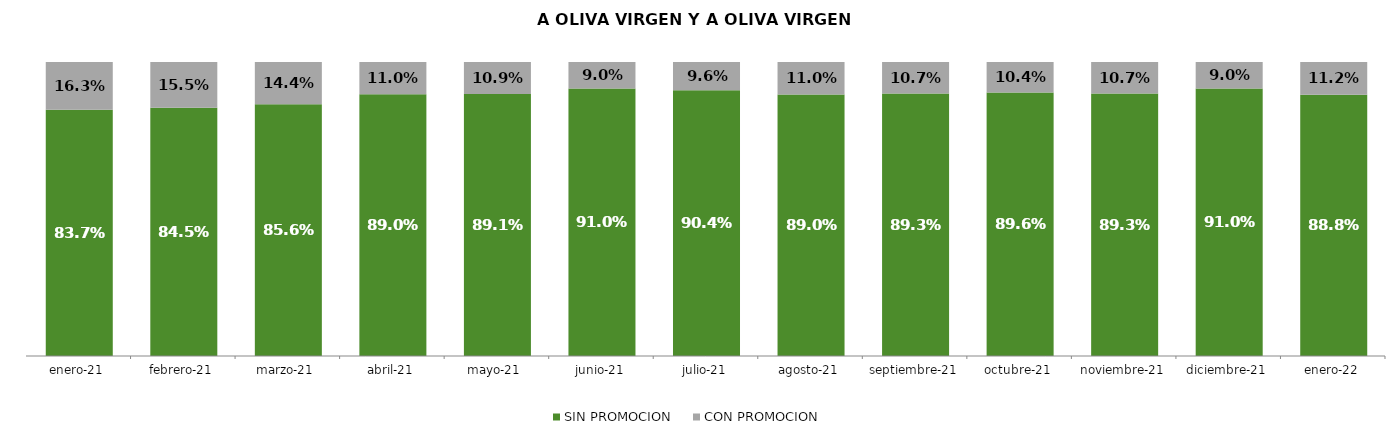
| Category | SIN PROMOCION   | CON PROMOCION   |
|---|---|---|
| 2021-01-01 | 0.837 | 0.163 |
| 2021-02-01 | 0.845 | 0.155 |
| 2021-03-01 | 0.856 | 0.144 |
| 2021-04-01 | 0.89 | 0.11 |
| 2021-05-01 | 0.891 | 0.109 |
| 2021-06-01 | 0.91 | 0.09 |
| 2021-07-01 | 0.904 | 0.096 |
| 2021-08-01 | 0.89 | 0.11 |
| 2021-09-01 | 0.893 | 0.107 |
| 2021-10-01 | 0.896 | 0.104 |
| 2021-11-01 | 0.893 | 0.107 |
| 2021-12-01 | 0.91 | 0.09 |
| 2022-01-01 | 0.888 | 0.112 |